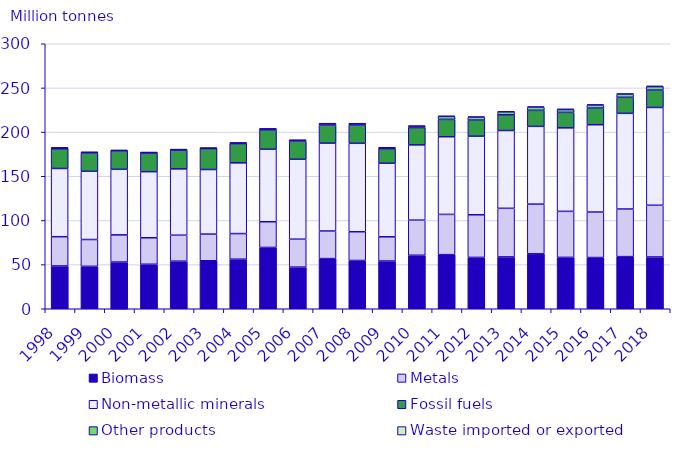
| Category | Biomass | Metals  | Non-metallic minerals | Fossil fuels | Other products | Waste imported or exported |
|---|---|---|---|---|---|---|
| 1998.0 | 48.45 | 33.124 | 77.234 | 22.307 | 1.083 | 0 |
| 1999.0 | 48.012 | 30.373 | 77.263 | 20.74 | 0.784 | 0 |
| 2000.0 | 52.89 | 30.749 | 74.22 | 21.066 | 0.882 | 0 |
| 2001.0 | 50.374 | 29.982 | 74.843 | 21.147 | 0.553 | 0 |
| 2002.0 | 53.847 | 29.421 | 75.081 | 21.298 | 0.531 | 0.002 |
| 2003.0 | 54.338 | 30.173 | 73.097 | 23.796 | 0.472 | 0.002 |
| 2004.0 | 56.122 | 28.995 | 80.051 | 21.838 | 0.702 | 0.002 |
| 2005.0 | 69.388 | 29.115 | 82.129 | 21.876 | 1.108 | 0.017 |
| 2006.0 | 47.124 | 31.629 | 90.495 | 20.558 | 1.006 | 0.008 |
| 2007.0 | 56.748 | 31.276 | 99.466 | 20.378 | 1.629 | 0.013 |
| 2008.0 | 54.644 | 32.553 | 100.126 | 20.614 | 1.537 | 0.027 |
| 2009.0 | 54.055 | 27.403 | 83.328 | 16.476 | 1.024 | 0.156 |
| 2010.0 | 60.553 | 39.747 | 85.219 | 19.63 | 1.573 | 0.29 |
| 2011.0 | 61.241 | 45.578 | 87.908 | 19.643 | 3.384 | 0.46 |
| 2012.0 | 58.132 | 48.252 | 88.97 | 18.269 | 3.263 | 0.534 |
| 2013.0 | 58.707 | 55.01 | 88.057 | 17.798 | 3.334 | 0.56 |
| 2014.0 | 62.179 | 56.273 | 88.018 | 18.189 | 3.507 | 0.667 |
| 2015.0 | 58.157 | 52.13 | 94.499 | 17.548 | 3.187 | 0.671 |
| 2016.0 | 57.97 | 51.509 | 98.845 | 18.861 | 3.379 | 0.712 |
| 2017.0 | 58.993 | 53.923 | 108.313 | 18.144 | 3.511 | 0.756 |
| 2018.0 | 58.626 | 58.546 | 110.679 | 19.708 | 3.934 | 0.737 |